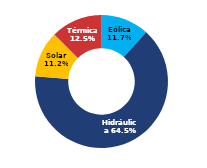
| Category | Sur |
|---|---|
| Eólica | 56.738 |
| Hidráulica | 311.831 |
| Solar | 54.263 |
| Térmica | 60.63 |